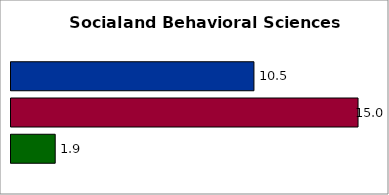
| Category | 50 states and D.C. | SREB states | State |
|---|---|---|---|
| 0 | 10.534 | 15.048 | 1.917 |